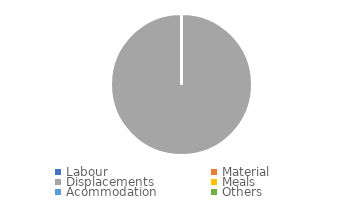
| Category | Series 0 |
|---|---|
| Labour | 0 |
| Material | 0 |
| Displacements | 6 |
| Meals | 0 |
| Acommodation | 0 |
| Others | 0 |